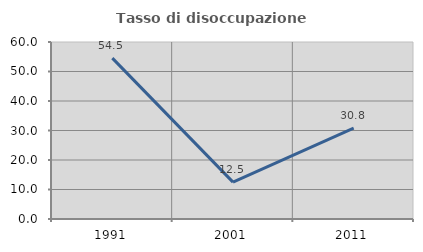
| Category | Tasso di disoccupazione giovanile  |
|---|---|
| 1991.0 | 54.545 |
| 2001.0 | 12.5 |
| 2011.0 | 30.769 |